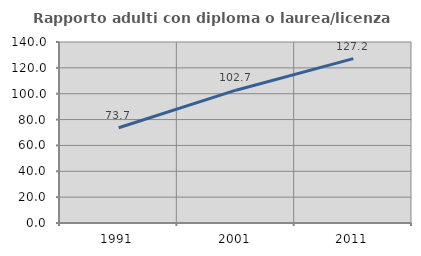
| Category | Rapporto adulti con diploma o laurea/licenza media  |
|---|---|
| 1991.0 | 73.684 |
| 2001.0 | 102.721 |
| 2011.0 | 127.152 |